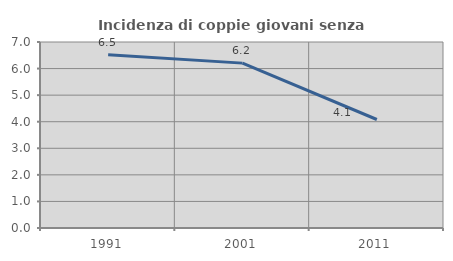
| Category | Incidenza di coppie giovani senza figli |
|---|---|
| 1991.0 | 6.516 |
| 2001.0 | 6.205 |
| 2011.0 | 4.083 |